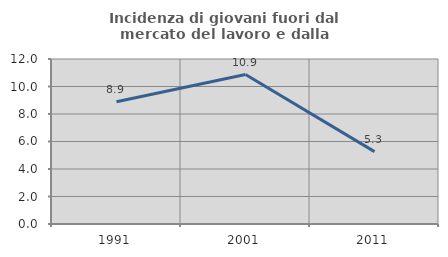
| Category | Incidenza di giovani fuori dal mercato del lavoro e dalla formazione  |
|---|---|
| 1991.0 | 8.889 |
| 2001.0 | 10.87 |
| 2011.0 | 5.263 |